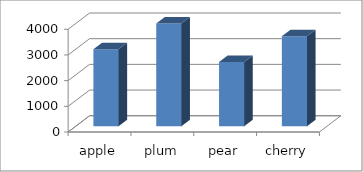
| Category | Series 0 |
|---|---|
| apple | 3000 |
| plum | 4000 |
| pear | 2500 |
| cherry | 3500 |